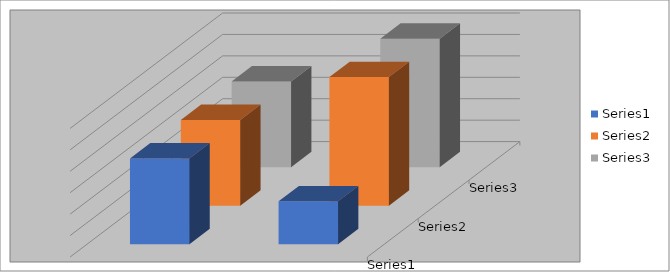
| Category | Series 0 | Series 1 | Series 2 |
|---|---|---|---|
| 0 | 2 | 2 | 2 |
| 1 | 1 | 3 | 3 |